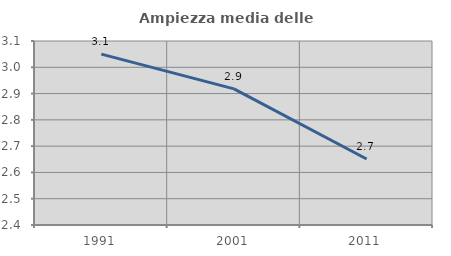
| Category | Ampiezza media delle famiglie |
|---|---|
| 1991.0 | 3.05 |
| 2001.0 | 2.918 |
| 2011.0 | 2.651 |